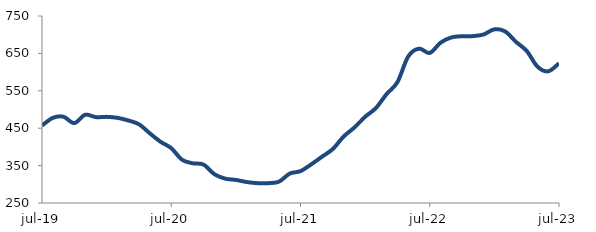
| Category | Series 0 |
|---|---|
| 2019-07-01 | 457.058 |
| 2019-08-01 | 477.544 |
| 2019-09-01 | 480.652 |
| 2019-10-01 | 463.67 |
| 2019-11-01 | 485.887 |
| 2019-12-01 | 479.593 |
| 2020-01-01 | 480.293 |
| 2020-02-01 | 477.774 |
| 2020-03-01 | 470.708 |
| 2020-04-01 | 460.537 |
| 2020-05-01 | 436.562 |
| 2020-06-01 | 413.857 |
| 2020-07-01 | 396.652 |
| 2020-08-01 | 365.687 |
| 2020-09-01 | 356.18 |
| 2020-10-01 | 352.658 |
| 2020-11-01 | 327.164 |
| 2020-12-01 | 315.173 |
| 2021-01-01 | 311.708 |
| 2021-02-01 | 306.103 |
| 2021-03-01 | 303.075 |
| 2021-04-01 | 303.034 |
| 2021-05-01 | 306.996 |
| 2021-06-01 | 328.614 |
| 2021-07-01 | 335.232 |
| 2021-08-01 | 353.414 |
| 2021-09-01 | 373.869 |
| 2021-10-01 | 394.393 |
| 2021-11-01 | 427.592 |
| 2021-12-01 | 451.83 |
| 2022-01-01 | 480.528 |
| 2022-02-01 | 503.882 |
| 2022-03-01 | 541.428 |
| 2022-04-01 | 573.261 |
| 2022-05-01 | 641.774 |
| 2022-06-01 | 662.728 |
| 2022-07-01 | 651.267 |
| 2022-08-01 | 678.506 |
| 2022-09-01 | 692.688 |
| 2022-10-01 | 695.873 |
| 2022-11-01 | 696.235 |
| 2022-12-01 | 700.598 |
| 2023-01-01 | 714.422 |
| 2023-02-01 | 708.75 |
| 2023-03-01 | 680.994 |
| 2023-04-01 | 656.708 |
| 2023-05-01 | 614.698 |
| 2023-06-01 | 602.139 |
| 2023-07-01 | 623.52 |